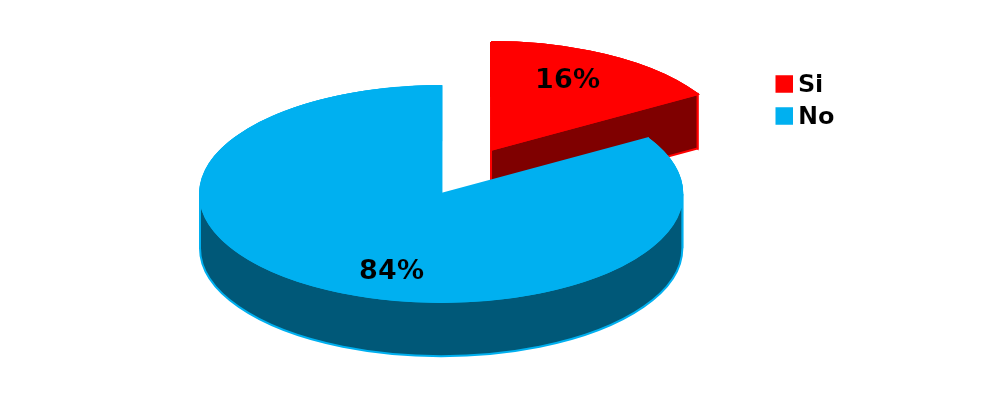
| Category | Series 0 |
|---|---|
| Si | 9 |
| No | 46 |